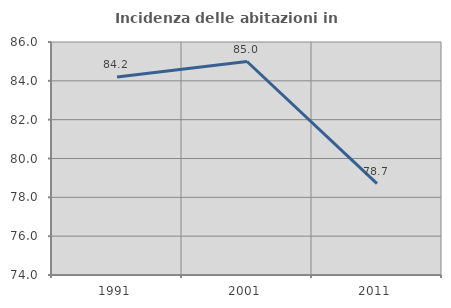
| Category | Incidenza delle abitazioni in proprietà  |
|---|---|
| 1991.0 | 84.195 |
| 2001.0 | 84.995 |
| 2011.0 | 78.707 |